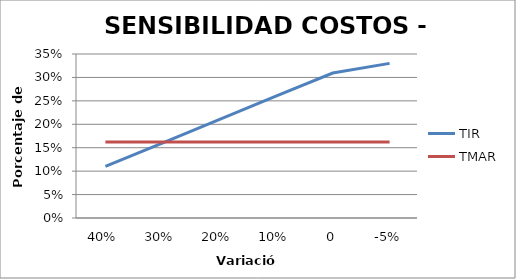
| Category | TIR | TMAR |
|---|---|---|
| 0.4 | 0.11 | 0.162 |
| 0.3 | 0.16 | 0.162 |
| 0.2 | 0.21 | 0.162 |
| 0.1 | 0.26 | 0.162 |
| 0.0 | 0.309 | 0.162 |
| -0.05 | 0.33 | 0.162 |